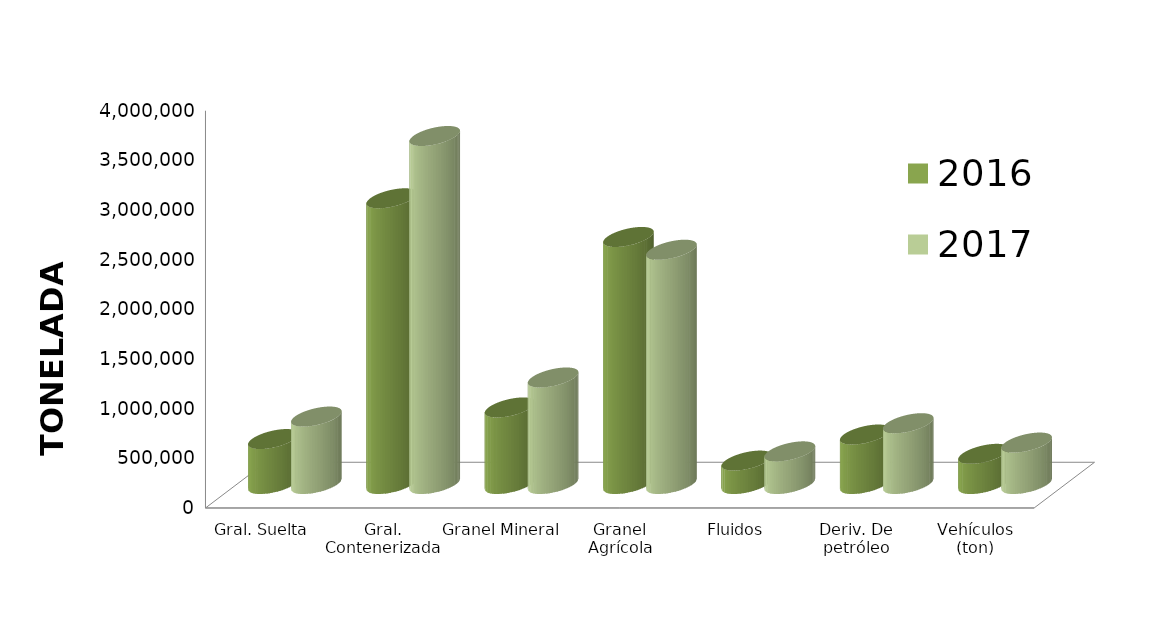
| Category | 2016 | 2017 |
|---|---|---|
| Gral. Suelta | 452469.011 | 678968.684 |
| Gral. Contenerizada | 2876585.618 | 3503806.908 |
| Granel Mineral | 770744.244 | 1072320.04 |
| Granel Agrícola | 2487190.584 | 2358701.595 |
| Fluidos | 235646.461 | 328540.297 |
| Deriv. De petróleo | 498036.975 | 611995.876 |
| Vehículos (ton) | 303617.033 | 417160.55 |